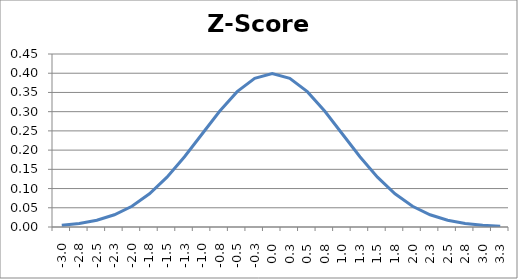
| Category | Series 0 |
|---|---|
| -3.0 | 0.004 |
| -2.75 | 0.009 |
| -2.5 | 0.018 |
| -2.25 | 0.032 |
| -2.0 | 0.054 |
| -1.75 | 0.086 |
| -1.5 | 0.13 |
| -1.25 | 0.183 |
| -1.0 | 0.242 |
| -0.75 | 0.301 |
| -0.5 | 0.352 |
| -0.25 | 0.387 |
| 0.0 | 0.399 |
| 0.25 | 0.387 |
| 0.5 | 0.352 |
| 0.75 | 0.301 |
| 1.0 | 0.242 |
| 1.25 | 0.183 |
| 1.5 | 0.13 |
| 1.75 | 0.086 |
| 2.0 | 0.054 |
| 2.25 | 0.032 |
| 2.5 | 0.018 |
| 2.75 | 0.009 |
| 3.0 | 0.004 |
| 3.25 | 0.002 |